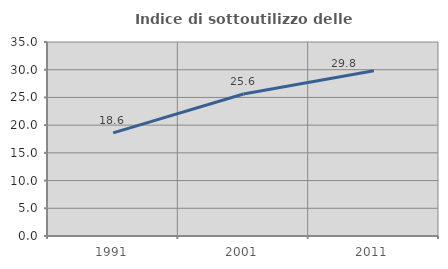
| Category | Indice di sottoutilizzo delle abitazioni  |
|---|---|
| 1991.0 | 18.612 |
| 2001.0 | 25.612 |
| 2011.0 | 29.8 |